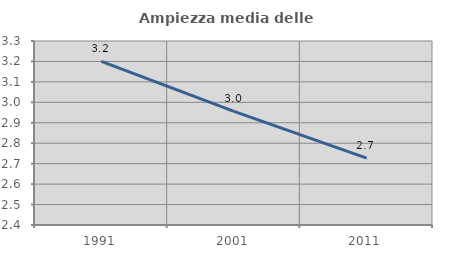
| Category | Ampiezza media delle famiglie |
|---|---|
| 1991.0 | 3.2 |
| 2001.0 | 2.956 |
| 2011.0 | 2.727 |